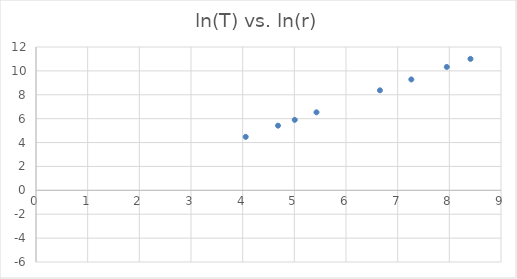
| Category | Series 0 |
|---|---|
| 4.05871738457895 | 4.477 |
| 4.6839813664123815 | 5.416 |
| 5.007965065540377 | 5.9 |
| 5.4289069362516384 | 6.532 |
| 6.656855050622885 | 8.373 |
| 7.26417018911501 | 9.283 |
| 7.950819621017435 | 10.331 |
| 8.409362961857484 | 11.005 |